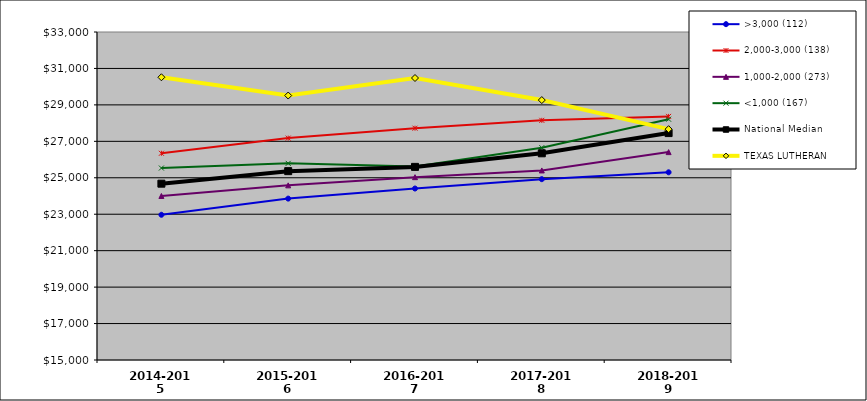
| Category | >3,000 (112) | 2,000-3,000 (138) | 1,000-2,000 (273) | <1,000 (167) | National Median | TEXAS LUTHERAN |
|---|---|---|---|---|---|---|
| 2014-2015 | 22969.504 | 26344.745 | 24001.526 | 25534.864 | 24676.206 | 30515.957 |
| 2015-2016 | 23856.645 | 27176.462 | 24584.354 | 25792.104 | 25364.205 | 29513.209 |
| 2016-2017 | 24410.671 | 27721.253 | 25033.27 | 25616.366 | 25597.574 | 30475.146 |
| 2017-2018 | 24923.464 | 28152.648 | 25402.681 | 26653.194 | 26342.841 | 29264.768 |
| 2018-2019 | 25300.155 | 28368.074 | 26408.556 | 28213.562 | 27452.913 | 27668.054 |